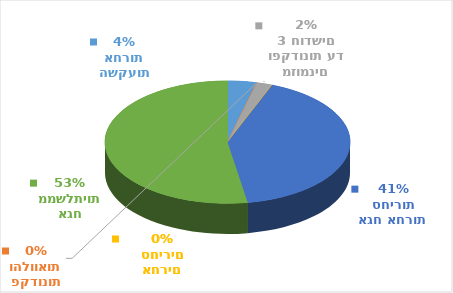
| Category | Series 0 | Series 1 |
|---|---|---|
| השקעות אחרות | 1490.5 | 0.038 |
| פקדונות והלוואות | 0 | 0 |
| מזומנים ופקדונות עד 3 חודשים | 803.227 | 0.021 |
| ניירות ערך אחרים סחירים | 0.03 | 0 |
| אגח אחרות סחירות | 16117.952 | 0.415 |
| אגח ממשלתיות | 20458.957 | 0.526 |